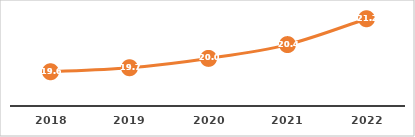
| Category | ALUMNOS POR DOCENTE (%) |
|---|---|
| 2018.0 | 19.57 |
| 2019.0 | 19.696 |
| 2020.0 | 19.988 |
| 2021.0 | 20.419 |
| 2022.0 | 21.227 |